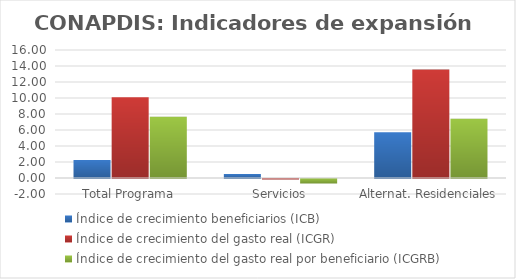
| Category | Índice de crecimiento beneficiarios (ICB)  | Índice de crecimiento del gasto real (ICGR)  | Índice de crecimiento del gasto real por beneficiario (ICGRB)  |
|---|---|---|---|
| Total Programa | 2.26 | 10.102 | 7.67 |
| Servicios | 0.507 | -0.063 | -0.567 |
| Alternat. Residenciales | 5.707 | 13.551 | 7.421 |